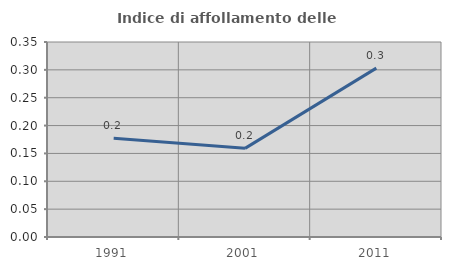
| Category | Indice di affollamento delle abitazioni  |
|---|---|
| 1991.0 | 0.177 |
| 2001.0 | 0.159 |
| 2011.0 | 0.303 |